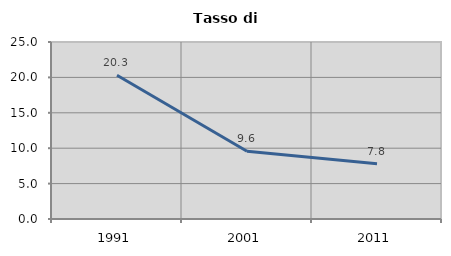
| Category | Tasso di disoccupazione   |
|---|---|
| 1991.0 | 20.301 |
| 2001.0 | 9.574 |
| 2011.0 | 7.797 |